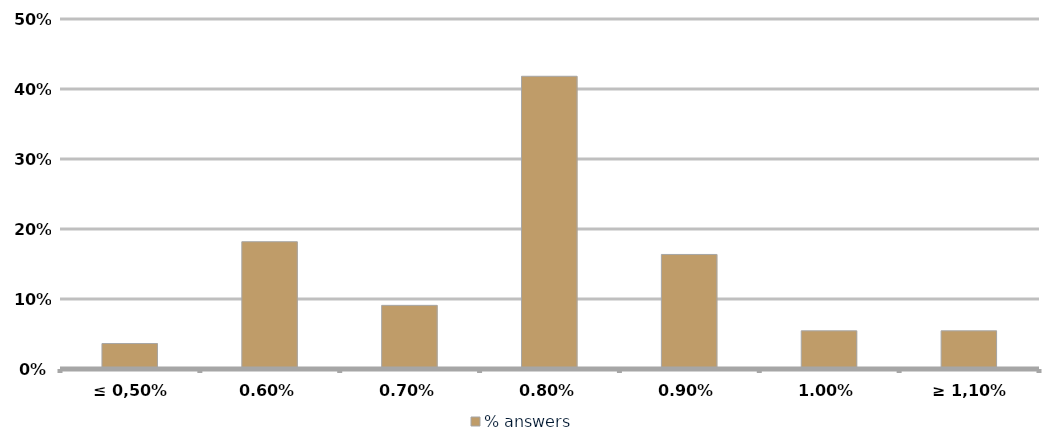
| Category | % answers |
|---|---|
| ≤ 0,50% | 0.036 |
| 0,60% | 0.182 |
| 0,70% | 0.091 |
| 0,80% | 0.418 |
| 0,90% | 0.164 |
| 1,00% | 0.055 |
| ≥ 1,10% | 0.055 |